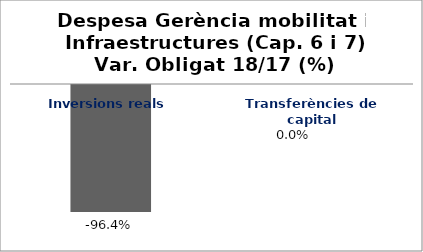
| Category | Series 0 |
|---|---|
| Inversions reals | -0.964 |
| Transferències de capital | 0 |